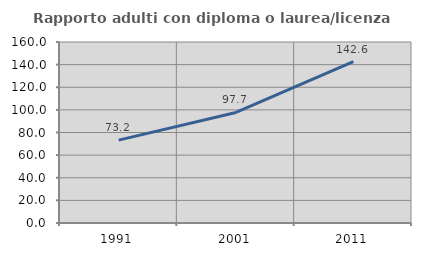
| Category | Rapporto adulti con diploma o laurea/licenza media  |
|---|---|
| 1991.0 | 73.245 |
| 2001.0 | 97.726 |
| 2011.0 | 142.569 |